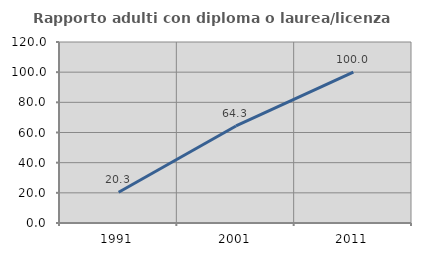
| Category | Rapporto adulti con diploma o laurea/licenza media  |
|---|---|
| 1991.0 | 20.347 |
| 2001.0 | 64.341 |
| 2011.0 | 100 |